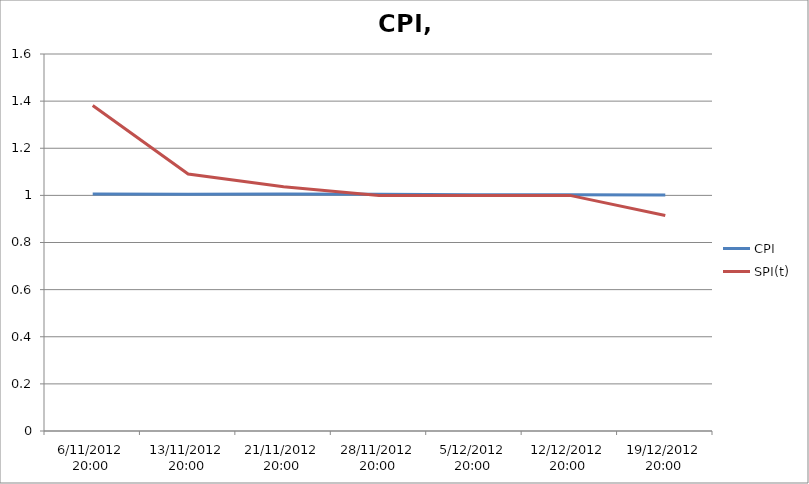
| Category | CPI | SPI(t) |
|---|---|---|
| 6/11/2012 20:00 | 1.006 | 1.382 |
| 13/11/2012 20:00 | 1.004 | 1.091 |
| 21/11/2012 20:00 | 1.005 | 1.036 |
| 28/11/2012 20:00 | 1.005 | 1 |
| 5/12/2012 20:00 | 1.003 | 1 |
| 12/12/2012 20:00 | 1.002 | 1 |
| 19/12/2012 20:00 | 1.002 | 0.914 |